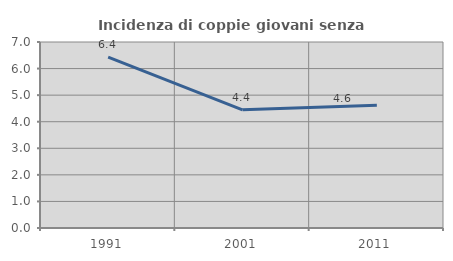
| Category | Incidenza di coppie giovani senza figli |
|---|---|
| 1991.0 | 6.432 |
| 2001.0 | 4.447 |
| 2011.0 | 4.618 |